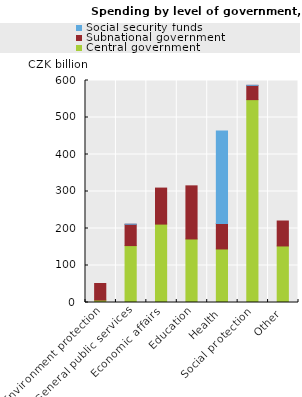
| Category | Central government | Subnational government | Social security funds |
|---|---|---|---|
| Environment protection | 6.619 | 44.688 | 0 |
| General public services | 153.82 | 57.639 | 0.09 |
| Economic affairs | 211.915 | 97.347 | 0 |
| Education | 171.733 | 143.536 | 0 |
| Health | 144.696 | 69.076 | 250.039 |
| Social protection | 548.307 | 38.559 | 0.009 |
| Other | 152.814 | 67.442 | 0 |